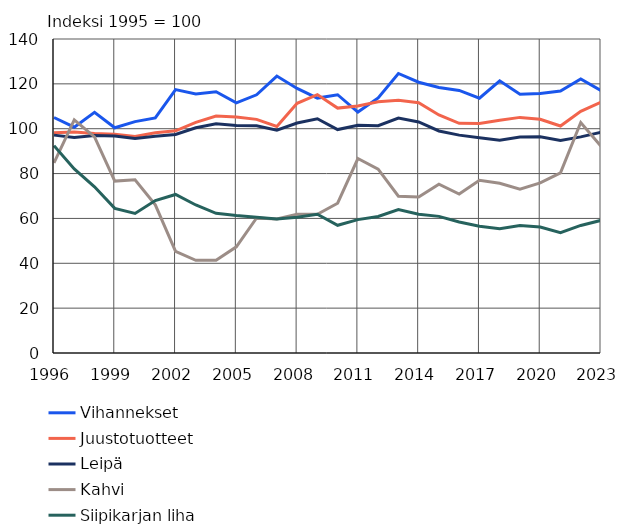
| Category | Vihannekset | Juustotuotteet | Leipä | Kahvi | Siipikarjan liha |
|---|---|---|---|---|---|
| 1996.0 | 105 | 98.23 | 97.14 | 84.77 | 92.45 |
| 1997.0 | 100.7 | 98.57 | 96.1 | 103.93 | 82.08 |
| 1998.0 | 107.32 | 97.83 | 96.92 | 96.38 | 74.09 |
| 1999.0 | 100.41 | 97.58 | 96.77 | 76.64 | 64.49 |
| 2000.0 | 103.16 | 96.51 | 95.59 | 77.22 | 62.22 |
| 2001.0 | 104.84 | 98.2 | 96.68 | 66.07 | 67.99 |
| 2002.0 | 117.43 | 99.08 | 97.42 | 45.29 | 70.68 |
| 2003.0 | 115.48 | 102.81 | 100.41 | 41.33 | 66 |
| 2004.0 | 116.48 | 105.64 | 102.22 | 41.38 | 62.29 |
| 2005.0 | 111.53 | 105.24 | 101.45 | 47.35 | 61.3 |
| 2006.0 | 115.11 | 104.16 | 101.36 | 60.22 | 60.53 |
| 2007.0 | 123.48 | 100.99 | 99.35 | 59.72 | 59.79 |
| 2008.0 | 117.95 | 111.32 | 102.55 | 61.85 | 60.48 |
| 2009.0 | 113.65 | 115.2 | 104.46 | 61.81 | 61.86 |
| 2010.0 | 115.15 | 109.19 | 99.62 | 66.78 | 56.93 |
| 2011.0 | 107.41 | 110.09 | 101.5 | 86.71 | 59.46 |
| 2012.0 | 113.75 | 112.03 | 101.33 | 81.95 | 60.85 |
| 2013.0 | 124.62 | 112.73 | 104.76 | 69.91 | 63.92 |
| 2014.0 | 120.73 | 111.6 | 103 | 69.56 | 61.91 |
| 2015.0 | 118.4 | 106.15 | 98.99 | 75.24 | 60.92 |
| 2016.0 | 117.06 | 102.43 | 97.14 | 70.88 | 58.43 |
| 2017.0 | 113.59 | 102.32 | 95.93 | 77.03 | 56.54 |
| 2018.0 | 121.34 | 103.79 | 94.89 | 75.66 | 55.4 |
| 2019.0 | 115.32 | 105.05 | 96.29 | 73.08 | 56.83 |
| 2020.0 | 115.71 | 104.21 | 96.44 | 75.88 | 56.16 |
| 2021.0 | 116.8 | 101.22 | 94.71 | 80.32 | 53.63 |
| 2022.0 | 122.19 | 107.76 | 96.36 | 102.76 | 56.88 |
| 2023.0 | 117 | 111.82 | 98.44 | 92.16 | 59.14 |